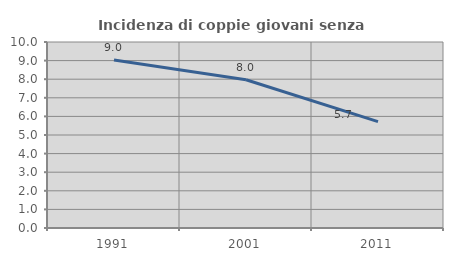
| Category | Incidenza di coppie giovani senza figli |
|---|---|
| 1991.0 | 9.028 |
| 2001.0 | 7.97 |
| 2011.0 | 5.722 |